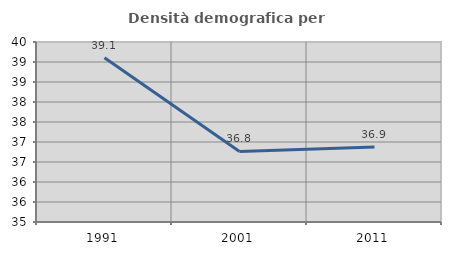
| Category | Densità demografica |
|---|---|
| 1991.0 | 39.104 |
| 2001.0 | 36.763 |
| 2011.0 | 36.873 |